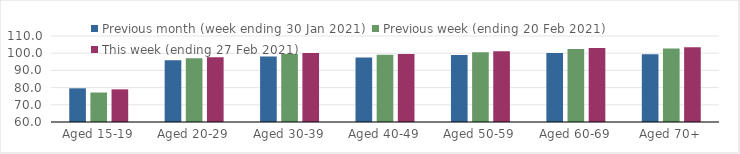
| Category | Previous month (week ending 30 Jan 2021) | Previous week (ending 20 Feb 2021) | This week (ending 27 Feb 2021) |
|---|---|---|---|
| Aged 15-19 | 79.59 | 77.14 | 78.98 |
| Aged 20-29 | 95.91 | 97.06 | 97.7 |
| Aged 30-39 | 98.02 | 99.58 | 100.15 |
| Aged 40-49 | 97.46 | 99.03 | 99.5 |
| Aged 50-59 | 98.99 | 100.6 | 101.09 |
| Aged 60-69 | 100.06 | 102.48 | 102.96 |
| Aged 70+ | 99.44 | 102.69 | 103.45 |